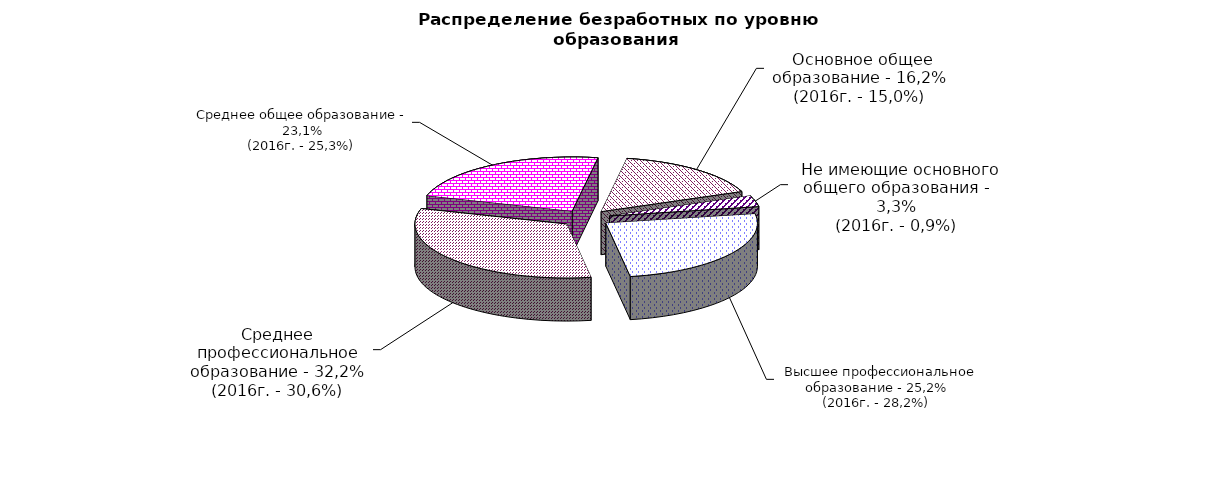
| Category | Series 0 |
|---|---|
|  - высшее профессиональное образование | 25.2 |
|  - среднее профессиональное образование | 32.2 |
|  - среднее общее образование | 23.1 |
|  - основное общее образование | 16.2 |
|  - не имеющие основного общего образования | 3.3 |